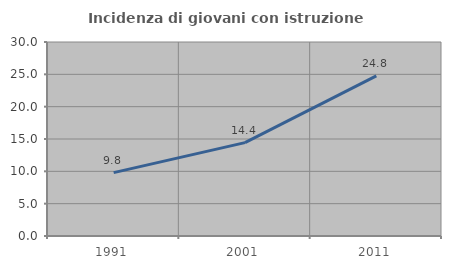
| Category | Incidenza di giovani con istruzione universitaria |
|---|---|
| 1991.0 | 9.795 |
| 2001.0 | 14.438 |
| 2011.0 | 24.766 |